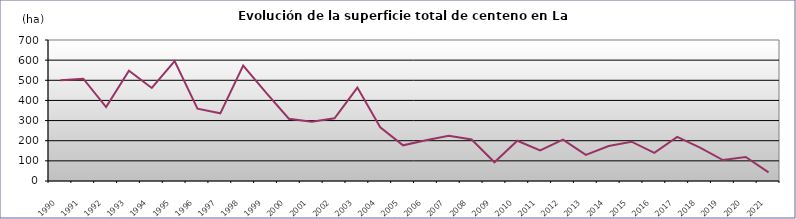
| Category | TOTAL |
|---|---|
| 1990.0 | 500 |
| 1991.0 | 508 |
| 1992.0 | 367 |
| 1993.0 | 547 |
| 1994.0 | 462 |
| 1995.0 | 595 |
| 1996.0 | 359 |
| 1997.0 | 336 |
| 1998.0 | 573 |
| 1999.0 | 439 |
| 2000.0 | 309 |
| 2001.0 | 294 |
| 2002.0 | 311 |
| 2003.0 | 464 |
| 2004.0 | 267 |
| 2005.0 | 177 |
| 2006.0 | 202 |
| 2007.0 | 224 |
| 2008.0 | 206 |
| 2009.0 | 93 |
| 2010.0 | 200 |
| 2011.0 | 152 |
| 2012.0 | 205 |
| 2013.0 | 130 |
| 2014.0 | 174 |
| 2015.0 | 195 |
| 2016.0 | 140 |
| 2017.0 | 219 |
| 2018.0 | 166 |
| 2019.0 | 104 |
| 2020.0 | 119 |
| 2021.0 | 43 |